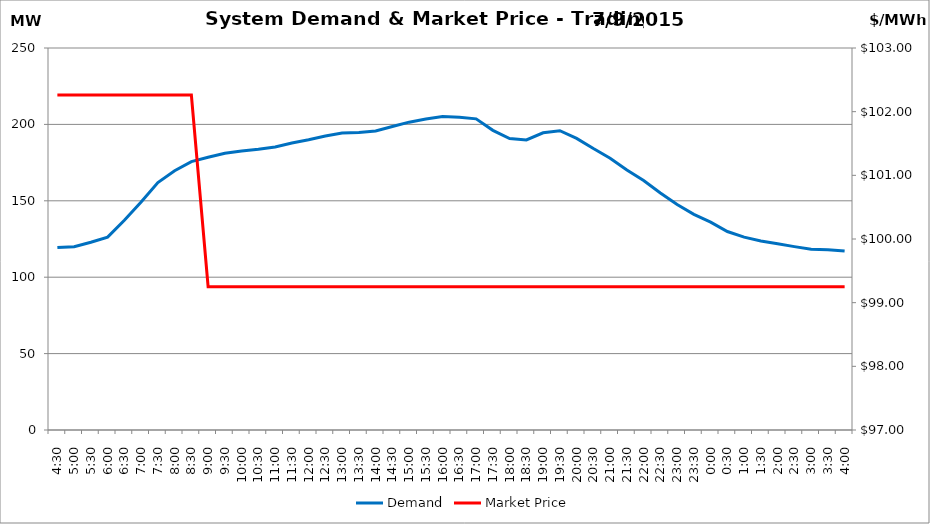
| Category | Demand |
|---|---|
| 0.1875 | 119.37 |
| 0.20833333333333334 | 119.99 |
| 0.22916666666666666 | 122.9 |
| 0.25 | 126.21 |
| 0.270833333333333 | 137.23 |
| 0.291666666666667 | 149.17 |
| 0.3125 | 161.95 |
| 0.333333333333333 | 169.63 |
| 0.354166666666667 | 175.67 |
| 0.375 | 178.49 |
| 0.395833333333333 | 181.11 |
| 0.416666666666667 | 182.56 |
| 0.4375 | 183.76 |
| 0.458333333333333 | 185.23 |
| 0.479166666666667 | 187.87 |
| 0.5 | 189.99 |
| 0.520833333333333 | 192.44 |
| 0.541666666666667 | 194.34 |
| 0.5625 | 194.72 |
| 0.583333333333333 | 195.69 |
| 0.604166666666667 | 198.61 |
| 0.625 | 201.46 |
| 0.645833333333334 | 203.56 |
| 0.666666666666667 | 205.15 |
| 0.6875 | 204.72 |
| 0.708333333333334 | 203.62 |
| 0.729166666666667 | 196.1 |
| 0.75 | 190.75 |
| 0.770833333333334 | 189.86 |
| 0.791666666666667 | 194.52 |
| 0.8125 | 195.88 |
| 0.833333333333334 | 190.85 |
| 0.854166666666667 | 184.18 |
| 0.875 | 177.87 |
| 0.895833333333334 | 170.11 |
| 0.916666666666667 | 163.27 |
| 0.9375 | 155.12 |
| 0.958333333333334 | 147.52 |
| 0.979166666666667 | 141.16 |
| 1900-01-01 | 136.07 |
| 1900-01-01 00:30:00 | 129.88 |
| 1900-01-01 01:00:00 | 126.24 |
| 1900-01-01 01:30:00 | 123.67 |
| 1900-01-01 02:00:00 | 121.89 |
| 1900-01-01 02:30:00 | 120.01 |
| 1900-01-01 03:00:00 | 118.24 |
| 1900-01-01 03:30:00 | 118.01 |
| 1900-01-01 04:00:00 | 117.13 |